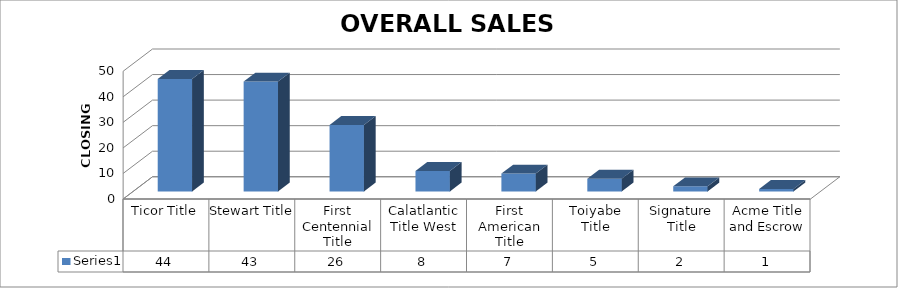
| Category | Series 0 |
|---|---|
| Ticor Title | 44 |
| Stewart Title | 43 |
| First Centennial Title | 26 |
| Calatlantic Title West | 8 |
| First American Title | 7 |
| Toiyabe Title | 5 |
| Signature Title | 2 |
| Acme Title and Escrow | 1 |